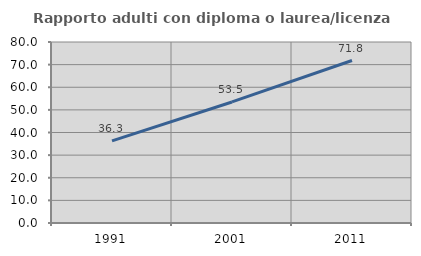
| Category | Rapporto adulti con diploma o laurea/licenza media  |
|---|---|
| 1991.0 | 36.323 |
| 2001.0 | 53.501 |
| 2011.0 | 71.806 |